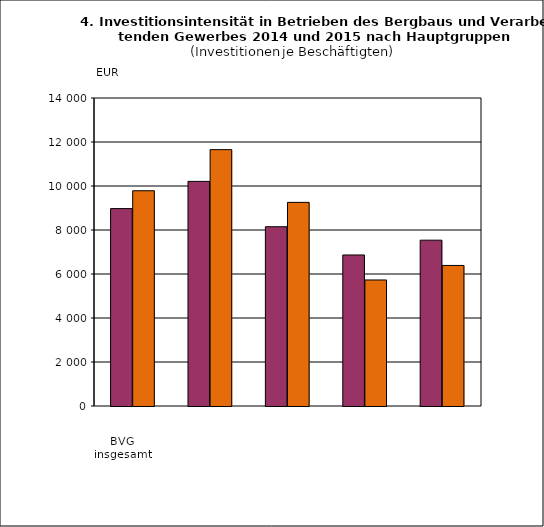
| Category | VJ | BJ |
|---|---|---|
| 0 | 8972.752 | 9784.733 |
| 1 | 10209.543 | 11653.054 |
| 2 | 8147.796 | 9256.031 |
| 3 | 6865.228 | 5728.603 |
| 4 | 7537.136 | 6388.509 |